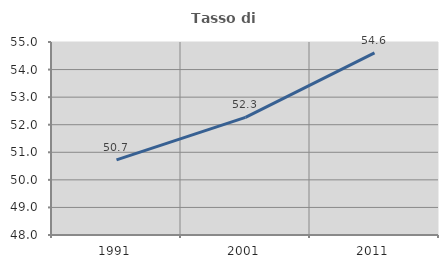
| Category | Tasso di occupazione   |
|---|---|
| 1991.0 | 50.722 |
| 2001.0 | 52.266 |
| 2011.0 | 54.608 |